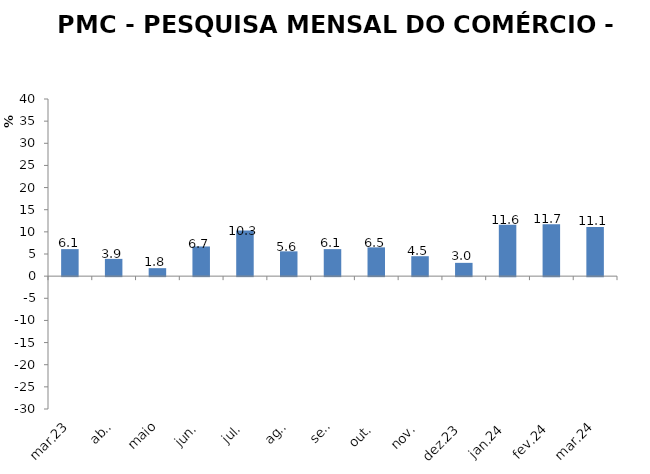
| Category | MENSAL |
|---|---|
| mar.23 | 6.1 |
| abr. | 3.9 |
| maio | 1.8 |
| jun. | 6.7 |
| jul. | 10.3 |
| ago. | 5.6 |
| set. | 6.1 |
| out. | 6.5 |
| nov. | 4.5 |
| dez.23 | 3 |
| jan.24 | 11.6 |
| fev.24 | 11.7 |
| mar.24 | 11.1 |